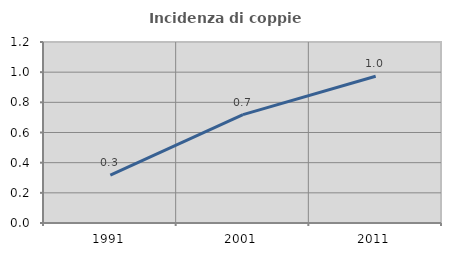
| Category | Incidenza di coppie miste |
|---|---|
| 1991.0 | 0.317 |
| 2001.0 | 0.718 |
| 2011.0 | 0.973 |